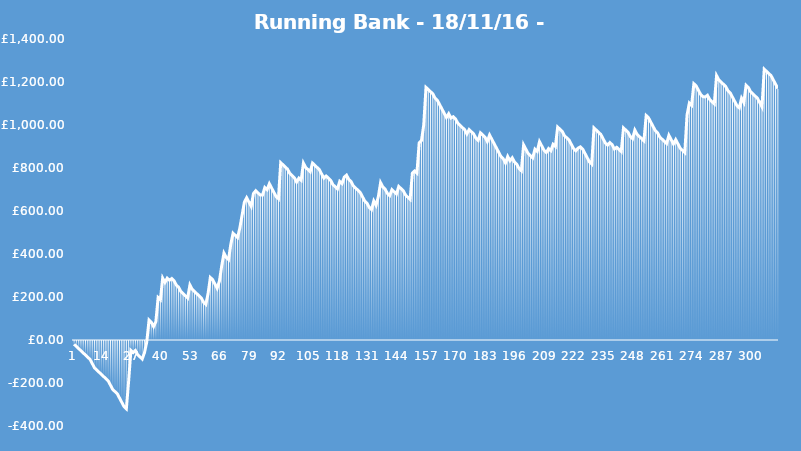
| Category | Series 0 |
|---|---|
| 0 | -20 |
| 1 | -30 |
| 2 | -40 |
| 3 | -50 |
| 4 | -60 |
| 5 | -70 |
| 6 | -80 |
| 7 | -90 |
| 8 | -110 |
| 9 | -130 |
| 10 | -140 |
| 11 | -150 |
| 12 | -160 |
| 13 | -170 |
| 14 | -180 |
| 15 | -190 |
| 16 | -210 |
| 17 | -230 |
| 18 | -240 |
| 19 | -250 |
| 20 | -270 |
| 21 | -290 |
| 22 | -310 |
| 23 | -320 |
| 24 | -192.5 |
| 25 | -48.5 |
| 26 | -58.5 |
| 27 | -48.5 |
| 28 | -68.5 |
| 29 | -78.5 |
| 30 | -88.5 |
| 31 | -58.5 |
| 32 | -8.5 |
| 33 | 92.8 |
| 34 | 82.8 |
| 35 | 62.8 |
| 36 | 85.3 |
| 37 | 197.8 |
| 38 | 187.8 |
| 39 | 287.8 |
| 40 | 267.8 |
| 41 | 287.8 |
| 42 | 277.8 |
| 43 | 285.8 |
| 44 | 275.8 |
| 45 | 255.8 |
| 46 | 245.8 |
| 47 | 225.8 |
| 48 | 215.8 |
| 49 | 205.8 |
| 50 | 195.8 |
| 51 | 255.8 |
| 52 | 235.8 |
| 53 | 225.8 |
| 54 | 215.8 |
| 55 | 205.8 |
| 56 | 195.8 |
| 57 | 175.8 |
| 58 | 165.8 |
| 59 | 215.8 |
| 60 | 290.8 |
| 61 | 280.8 |
| 62 | 260.8 |
| 63 | 240.8 |
| 64 | 274.1 |
| 65 | 344.1 |
| 66 | 404.1 |
| 67 | 384.1 |
| 68 | 374.1 |
| 69 | 444.1 |
| 70 | 496.6 |
| 71 | 486.6 |
| 72 | 476.6 |
| 73 | 521.6 |
| 74 | 581.6 |
| 75 | 641.6 |
| 76 | 661.6 |
| 77 | 641.6 |
| 78 | 621.6 |
| 79 | 681.6 |
| 80 | 694.1 |
| 81 | 684.1 |
| 82 | 674.1 |
| 83 | 674.3 |
| 84 | 709.3 |
| 85 | 699.3 |
| 86 | 726.8 |
| 87 | 706.8 |
| 88 | 686.8 |
| 89 | 666.8 |
| 90 | 656.8 |
| 91 | 824.8 |
| 92 | 814.8 |
| 93 | 804.8 |
| 94 | 794.8 |
| 95 | 774.8 |
| 96 | 764.8 |
| 97 | 754.8 |
| 98 | 734.8 |
| 99 | 752.8 |
| 100 | 742.8 |
| 101 | 822.8 |
| 102 | 802.8 |
| 103 | 792.8 |
| 104 | 782.8 |
| 105 | 822.8 |
| 106 | 812.8 |
| 107 | 802.8 |
| 108 | 792.8 |
| 109 | 772.8 |
| 110 | 752.8 |
| 111 | 762.8 |
| 112 | 752.8 |
| 113 | 742.8 |
| 114 | 722.8 |
| 115 | 712.8 |
| 116 | 702.8 |
| 117 | 737.8 |
| 118 | 727.8 |
| 119 | 757.8 |
| 120 | 766.7 |
| 121 | 746.7 |
| 122 | 736.7 |
| 123 | 716.7 |
| 124 | 706.7 |
| 125 | 696.7 |
| 126 | 686.7 |
| 127 | 666.7 |
| 128 | 646.7 |
| 129 | 636.7 |
| 130 | 616.7 |
| 131 | 606.7 |
| 132 | 646.7 |
| 133 | 626.7 |
| 134 | 666.7 |
| 135 | 731.7 |
| 136 | 711.7 |
| 137 | 701.7 |
| 138 | 681.7 |
| 139 | 671.7 |
| 140 | 699.2 |
| 141 | 689.2 |
| 142 | 679.2 |
| 143 | 714.2 |
| 144 | 704.2 |
| 145 | 694.2 |
| 146 | 674.2 |
| 147 | 664.2 |
| 148 | 654.2 |
| 149 | 776.2 |
| 150 | 786.2 |
| 151 | 776.2 |
| 152 | 917.2 |
| 153 | 927.5 |
| 154 | 1000 |
| 155 | 1175 |
| 156 | 1165 |
| 157 | 1155 |
| 158 | 1145 |
| 159 | 1125 |
| 160 | 1115 |
| 161 | 1095 |
| 162 | 1075 |
| 163 | 1055 |
| 164 | 1035 |
| 165 | 1052.5 |
| 166 | 1032.5 |
| 167 | 1038.5 |
| 168 | 1028.5 |
| 169 | 1008.5 |
| 170 | 998.5 |
| 171 | 988.5 |
| 172 | 978.5 |
| 173 | 958.5 |
| 174 | 978.5 |
| 175 | 968.5 |
| 176 | 958.5 |
| 177 | 938.5 |
| 178 | 928.5 |
| 179 | 963.5 |
| 180 | 953.5 |
| 181 | 943.5 |
| 182 | 923.5 |
| 183 | 953.5 |
| 184 | 933.5 |
| 185 | 913.5 |
| 186 | 893.5 |
| 187 | 873.5 |
| 188 | 853.5 |
| 189 | 843.5 |
| 190 | 823.5 |
| 191 | 853.5 |
| 192 | 833.5 |
| 193 | 847.3 |
| 194 | 827.3 |
| 195 | 817.3 |
| 196 | 797.3 |
| 197 | 787.3 |
| 198 | 907.3 |
| 199 | 887.3 |
| 200 | 867.3 |
| 201 | 857.3 |
| 202 | 847.3 |
| 203 | 887.3 |
| 204 | 877.3 |
| 205 | 922.3 |
| 206 | 902.3 |
| 207 | 882.3 |
| 208 | 872.3 |
| 209 | 890.3 |
| 210 | 880.3 |
| 211 | 910.3 |
| 212 | 900.3 |
| 213 | 990.3 |
| 214 | 980.3 |
| 215 | 970.3 |
| 216 | 950.3 |
| 217 | 940.3 |
| 218 | 930.3 |
| 219 | 910.3 |
| 220 | 890.3 |
| 221 | 880.3 |
| 222 | 892.3 |
| 223 | 898.3 |
| 224 | 888.3 |
| 225 | 868.3 |
| 226 | 848.3 |
| 227 | 828.3 |
| 228 | 818.3 |
| 229 | 986.3 |
| 230 | 976.3 |
| 231 | 966.3 |
| 232 | 956.3 |
| 233 | 936.3 |
| 234 | 916.3 |
| 235 | 906.3 |
| 236 | 918.3 |
| 237 | 908.3 |
| 238 | 888.3 |
| 239 | 896.3 |
| 240 | 886.3 |
| 241 | 876.3 |
| 242 | 986.3 |
| 243 | 976.3 |
| 244 | 966.3 |
| 245 | 946.3 |
| 246 | 936.3 |
| 247 | 976.3 |
| 248 | 956.3 |
| 249 | 946.3 |
| 250 | 936.3 |
| 251 | 926.3 |
| 252 | 1043.9 |
| 253 | 1033.9 |
| 254 | 1013.9 |
| 255 | 993.9 |
| 256 | 973.9 |
| 257 | 963.9 |
| 258 | 943.9 |
| 259 | 933.9 |
| 260 | 923.9 |
| 261 | 913.9 |
| 262 | 951.9 |
| 263 | 931.9 |
| 264 | 911.9 |
| 265 | 931.9 |
| 266 | 911.9 |
| 267 | 891.9 |
| 268 | 881.9 |
| 269 | 871.9 |
| 270 | 1046.9 |
| 271 | 1101.9 |
| 272 | 1091.9 |
| 273 | 1191.9 |
| 274 | 1181.9 |
| 275 | 1161.9 |
| 276 | 1141.9 |
| 277 | 1131.9 |
| 278 | 1130.3 |
| 279 | 1138.3 |
| 280 | 1118.3 |
| 281 | 1108.3 |
| 282 | 1098.3 |
| 283 | 1229.6 |
| 284 | 1209.6 |
| 285 | 1199.6 |
| 286 | 1189.6 |
| 287 | 1179.6 |
| 288 | 1159.6 |
| 289 | 1149.6 |
| 290 | 1129.6 |
| 291 | 1109.6 |
| 292 | 1089.6 |
| 293 | 1079.6 |
| 294 | 1124.6 |
| 295 | 1104.6 |
| 296 | 1184.6 |
| 297 | 1174.6 |
| 298 | 1154.6 |
| 299 | 1144.6 |
| 300 | 1134.6 |
| 301 | 1124.6 |
| 302 | 1104.6 |
| 303 | 1084.6 |
| 304 | 1259.6 |
| 305 | 1249.6 |
| 306 | 1239.6 |
| 307 | 1229.6 |
| 308 | 1209.6 |
| 309 | 1189.6 |
| 310 | 1169.6 |